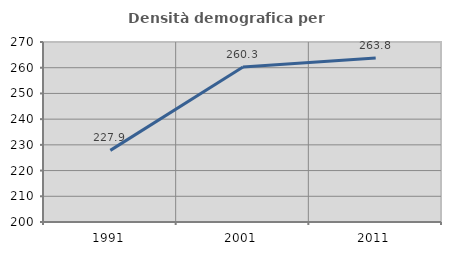
| Category | Densità demografica |
|---|---|
| 1991.0 | 227.856 |
| 2001.0 | 260.273 |
| 2011.0 | 263.772 |